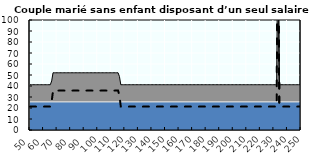
| Category | Coin fiscal marginal (somme des composantes) | Taux d’imposition marginal net |
|---|---|---|
| 50.0 | 41.166 | 21.28 |
| 51.0 | 41.166 | 21.28 |
| 52.0 | 41.166 | 21.28 |
| 53.0 | 41.166 | 21.28 |
| 54.0 | 41.166 | 21.28 |
| 55.0 | 41.166 | 21.28 |
| 56.0 | 41.166 | 21.28 |
| 57.0 | 41.166 | 21.28 |
| 58.0 | 41.166 | 21.28 |
| 59.0 | 41.166 | 21.28 |
| 60.0 | 41.166 | 21.28 |
| 61.0 | 41.166 | 21.28 |
| 62.0 | 41.166 | 21.28 |
| 63.0 | 41.166 | 21.28 |
| 64.0 | 41.166 | 21.28 |
| 65.0 | 41.166 | 21.28 |
| 66.0 | 44.624 | 25.907 |
| 67.0 | 52.028 | 35.813 |
| 68.0 | 52.028 | 35.813 |
| 69.0 | 52.028 | 35.813 |
| 70.0 | 52.028 | 35.813 |
| 71.0 | 52.028 | 35.813 |
| 72.0 | 52.028 | 35.813 |
| 73.0 | 52.028 | 35.813 |
| 74.0 | 52.028 | 35.813 |
| 75.0 | 52.028 | 35.813 |
| 76.0 | 52.028 | 35.813 |
| 77.0 | 52.028 | 35.813 |
| 78.0 | 52.028 | 35.813 |
| 79.0 | 52.028 | 35.813 |
| 80.0 | 52.028 | 35.813 |
| 81.0 | 52.028 | 35.813 |
| 82.0 | 52.028 | 35.813 |
| 83.0 | 52.028 | 35.813 |
| 84.0 | 52.028 | 35.813 |
| 85.0 | 52.028 | 35.813 |
| 86.0 | 52.028 | 35.813 |
| 87.0 | 52.028 | 35.813 |
| 88.0 | 52.028 | 35.813 |
| 89.0 | 52.028 | 35.813 |
| 90.0 | 52.028 | 35.813 |
| 91.0 | 52.028 | 35.813 |
| 92.0 | 52.028 | 35.813 |
| 93.0 | 52.028 | 35.813 |
| 94.0 | 52.028 | 35.813 |
| 95.0 | 52.028 | 35.813 |
| 96.0 | 52.028 | 35.813 |
| 97.0 | 52.028 | 35.813 |
| 98.0 | 52.028 | 35.813 |
| 99.0 | 52.028 | 35.813 |
| 100.0 | 52.028 | 35.813 |
| 101.0 | 52.028 | 35.813 |
| 102.0 | 52.028 | 35.813 |
| 103.0 | 52.028 | 35.813 |
| 104.0 | 52.028 | 35.813 |
| 105.0 | 52.028 | 35.813 |
| 106.0 | 52.028 | 35.813 |
| 107.0 | 52.028 | 35.813 |
| 108.0 | 52.028 | 35.813 |
| 109.0 | 52.028 | 35.813 |
| 110.0 | 52.028 | 35.813 |
| 111.0 | 52.028 | 35.813 |
| 112.0 | 52.028 | 35.813 |
| 113.0 | 52.028 | 35.813 |
| 114.0 | 52.028 | 35.813 |
| 115.0 | 52.028 | 35.813 |
| 116.0 | 48.692 | 31.35 |
| 117.0 | 41.166 | 21.28 |
| 118.0 | 41.166 | 21.28 |
| 119.0 | 41.166 | 21.28 |
| 120.0 | 41.166 | 21.28 |
| 121.0 | 41.166 | 21.28 |
| 122.0 | 41.166 | 21.28 |
| 123.0 | 41.166 | 21.28 |
| 124.0 | 41.166 | 21.28 |
| 125.0 | 41.166 | 21.28 |
| 126.0 | 41.166 | 21.28 |
| 127.0 | 41.166 | 21.28 |
| 128.0 | 41.166 | 21.28 |
| 129.0 | 41.166 | 21.28 |
| 130.0 | 41.166 | 21.28 |
| 131.0 | 41.166 | 21.28 |
| 132.0 | 41.166 | 21.28 |
| 133.0 | 41.166 | 21.28 |
| 134.0 | 41.166 | 21.28 |
| 135.0 | 41.166 | 21.28 |
| 136.0 | 41.166 | 21.28 |
| 137.0 | 41.166 | 21.28 |
| 138.0 | 41.166 | 21.28 |
| 139.0 | 41.166 | 21.28 |
| 140.0 | 41.166 | 21.28 |
| 141.0 | 41.166 | 21.28 |
| 142.0 | 41.166 | 21.28 |
| 143.0 | 41.166 | 21.28 |
| 144.0 | 41.166 | 21.28 |
| 145.0 | 41.166 | 21.28 |
| 146.0 | 41.166 | 21.28 |
| 147.0 | 41.166 | 21.28 |
| 148.0 | 41.166 | 21.28 |
| 149.0 | 41.166 | 21.28 |
| 150.0 | 41.166 | 21.28 |
| 151.0 | 41.166 | 21.28 |
| 152.0 | 41.166 | 21.28 |
| 153.0 | 41.166 | 21.28 |
| 154.0 | 41.166 | 21.28 |
| 155.0 | 41.166 | 21.28 |
| 156.0 | 41.166 | 21.28 |
| 157.0 | 41.166 | 21.28 |
| 158.0 | 41.166 | 21.28 |
| 159.0 | 41.166 | 21.28 |
| 160.0 | 41.166 | 21.28 |
| 161.0 | 41.166 | 21.28 |
| 162.0 | 41.166 | 21.28 |
| 163.0 | 41.166 | 21.28 |
| 164.0 | 41.166 | 21.28 |
| 165.0 | 41.166 | 21.28 |
| 166.0 | 41.166 | 21.28 |
| 167.0 | 41.166 | 21.28 |
| 168.0 | 41.166 | 21.28 |
| 169.0 | 41.166 | 21.28 |
| 170.0 | 41.166 | 21.28 |
| 171.0 | 41.166 | 21.28 |
| 172.0 | 41.166 | 21.28 |
| 173.0 | 41.166 | 21.28 |
| 174.0 | 41.166 | 21.28 |
| 175.0 | 41.166 | 21.28 |
| 176.0 | 41.166 | 21.28 |
| 177.0 | 41.166 | 21.28 |
| 178.0 | 41.166 | 21.28 |
| 179.0 | 41.166 | 21.28 |
| 180.0 | 41.166 | 21.28 |
| 181.0 | 41.166 | 21.28 |
| 182.0 | 41.166 | 21.28 |
| 183.0 | 41.166 | 21.28 |
| 184.0 | 41.166 | 21.28 |
| 185.0 | 41.166 | 21.28 |
| 186.0 | 41.166 | 21.28 |
| 187.0 | 41.166 | 21.28 |
| 188.0 | 41.166 | 21.28 |
| 189.0 | 41.166 | 21.28 |
| 190.0 | 41.166 | 21.28 |
| 191.0 | 41.166 | 21.28 |
| 192.0 | 41.166 | 21.28 |
| 193.0 | 41.166 | 21.28 |
| 194.0 | 41.166 | 21.28 |
| 195.0 | 41.166 | 21.28 |
| 196.0 | 41.166 | 21.28 |
| 197.0 | 41.166 | 21.28 |
| 198.0 | 41.166 | 21.28 |
| 199.0 | 41.166 | 21.28 |
| 200.0 | 41.166 | 21.28 |
| 201.0 | 41.166 | 21.28 |
| 202.0 | 41.166 | 21.28 |
| 203.0 | 41.166 | 21.28 |
| 204.0 | 41.166 | 21.28 |
| 205.0 | 41.166 | 21.28 |
| 206.0 | 41.166 | 21.28 |
| 207.0 | 41.166 | 21.28 |
| 208.0 | 41.166 | 21.28 |
| 209.0 | 41.166 | 21.28 |
| 210.0 | 41.166 | 21.28 |
| 211.0 | 41.166 | 21.28 |
| 212.0 | 41.166 | 21.28 |
| 213.0 | 41.166 | 21.28 |
| 214.0 | 41.166 | 21.28 |
| 215.0 | 41.166 | 21.28 |
| 216.0 | 41.166 | 21.28 |
| 217.0 | 41.166 | 21.28 |
| 218.0 | 41.166 | 21.28 |
| 219.0 | 41.166 | 21.28 |
| 220.0 | 41.166 | 21.28 |
| 221.0 | 41.166 | 21.28 |
| 222.0 | 41.166 | 21.28 |
| 223.0 | 41.166 | 21.28 |
| 224.0 | 41.166 | 21.28 |
| 225.0 | 41.166 | 21.28 |
| 226.0 | 41.166 | 21.28 |
| 227.0 | 41.166 | 21.28 |
| 228.0 | 41.166 | 21.28 |
| 229.0 | 41.166 | 21.28 |
| 230.0 | 41.166 | 21.28 |
| 231.0 | 41.166 | 21.28 |
| 232.0 | 41.166 | 21.28 |
| 233.0 | 190.676 | 221.325 |
| 234.0 | 41.166 | 21.28 |
| 235.0 | 41.166 | 21.28 |
| 236.0 | 41.166 | 21.28 |
| 237.0 | 41.166 | 21.28 |
| 238.0 | 41.166 | 21.28 |
| 239.0 | 41.166 | 21.28 |
| 240.0 | 41.166 | 21.28 |
| 241.0 | 41.166 | 21.28 |
| 242.0 | 41.166 | 21.28 |
| 243.0 | 41.166 | 21.28 |
| 244.0 | 41.166 | 21.28 |
| 245.0 | 41.166 | 21.28 |
| 246.0 | 41.166 | 21.28 |
| 247.0 | 41.166 | 21.28 |
| 248.0 | 41.166 | 21.28 |
| 249.0 | 41.166 | 21.28 |
| 250.0 | 41.166 | 21.28 |